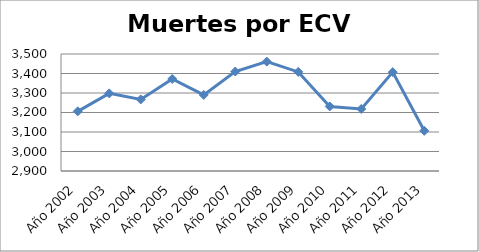
| Category | Series 0 |
|---|---|
| Año 2002 | 3206 |
| Año 2003 | 3298 |
| Año 2004 | 3267 |
| Año 2005 | 3372 |
| Año 2006 | 3290 |
| Año 2007 | 3410 |
| Año 2008 | 3461 |
| Año 2009 | 3408 |
| Año 2010 | 3231 |
| Año 2011 | 3218 |
| Año 2012 | 3407 |
| Año 2013 | 3106 |